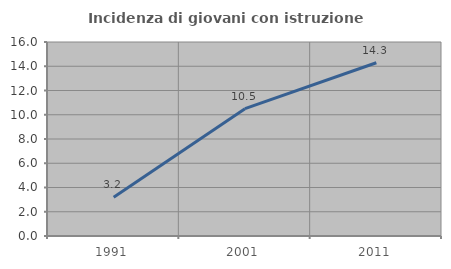
| Category | Incidenza di giovani con istruzione universitaria |
|---|---|
| 1991.0 | 3.196 |
| 2001.0 | 10.502 |
| 2011.0 | 14.286 |